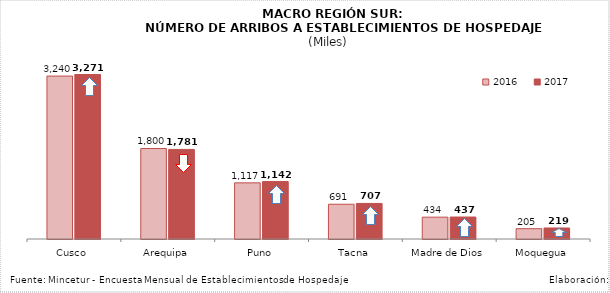
| Category | 2016 | 2017 |
|---|---|---|
| Cusco | 3239.804 | 3270.803 |
| Arequipa | 1799.754 | 1781.324 |
| Puno | 1116.585 | 1142.442 |
| Tacna | 691.241 | 706.918 |
| Madre de Dios | 434.344 | 436.694 |
| Moquegua | 205.247 | 218.88 |